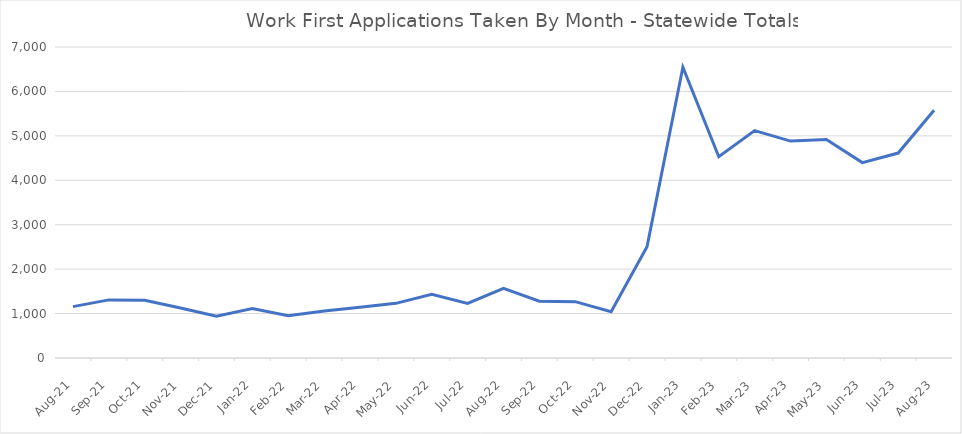
| Category | Series 0 |
|---|---|
| 2023-08-23 | 5577 |
| 2023-07-23 | 4613 |
| 2023-06-23 | 4398 |
| 2023-05-23 | 4918 |
| 2023-04-23 | 4882 |
| 2023-03-23 | 5117 |
| 2023-02-01 | 4530 |
| 2023-01-01 | 6546 |
| 2022-12-01 | 2505 |
| 2022-11-22 | 1044 |
| 2022-10-22 | 1268 |
| 2022-09-22 | 1279 |
| 2022-08-22 | 1568 |
| 2022-07-22 | 1228 |
| 2022-06-01 | 1433 |
| 2022-05-01 | 1230 |
| 2022-04-01 | 1142 |
| 2022-03-01 | 1056 |
| 2022-02-01 | 953 |
| 2022-01-01 | 1113 |
| 2021-12-02 | 940 |
| 2021-11-01 | 1127 |
| 2021-10-01 | 1301 |
| 2021-09-01 | 1308 |
| 2021-08-01 | 1156 |